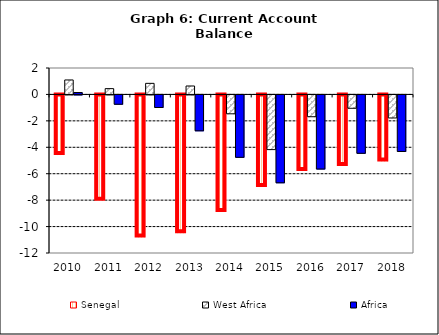
| Category | Senegal | West Africa | Africa |
|---|---|---|---|
| 2010.0 | -4.514 | 1.095 | 0.144 |
| 2011.0 | -7.977 | 0.439 | -0.706 |
| 2012.0 | -10.749 | 0.839 | -0.95 |
| 2013.0 | -10.436 | 0.638 | -2.715 |
| 2014.0 | -8.815 | -1.429 | -4.722 |
| 2015.0 | -6.925 | -4.138 | -6.65 |
| 2016.0 | -5.72 | -1.65 | -5.608 |
| 2017.0 | -5.339 | -1.011 | -4.418 |
| 2018.0 | -5.001 | -1.744 | -4.278 |